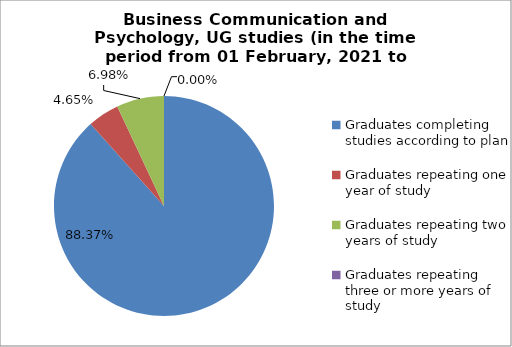
| Category | Series 0 |
|---|---|
| Graduates completing studies according to plan | 88.372 |
| Graduates repeating one year of study | 4.651 |
| Graduates repeating two years of study | 6.977 |
| Graduates repeating three or more years of study | 0 |